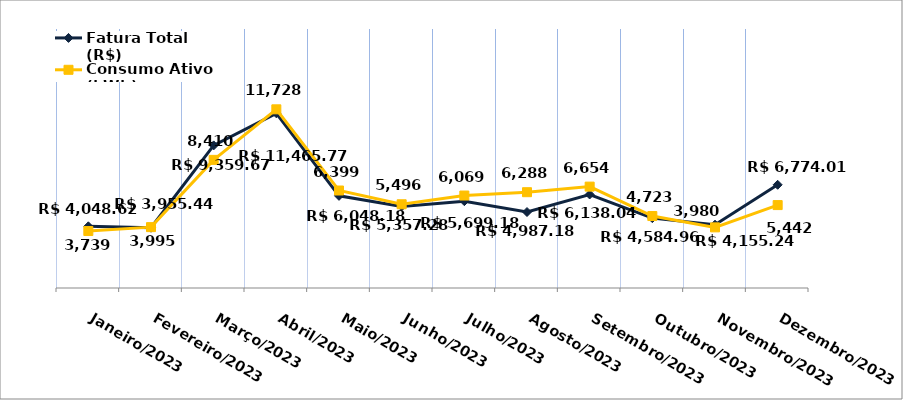
| Category | Fatura Total (R$) |
|---|---|
| Janeiro/2023 | 4048.62 |
| Fevereiro/2023 | 3955.44 |
| Março/2023 | 9359.67 |
| Abril/2023 | 11465.77 |
| Maio/2023 | 6048.18 |
| Junho/2023 | 5357.28 |
| Julho/2023 | 5699.18 |
| Agosto/2023 | 4987.18 |
| Setembro/2023 | 6138.04 |
| Outubro/2023 | 4584.96 |
| Novembro/2023 | 4155.24 |
| Dezembro/2023 | 6774.01 |